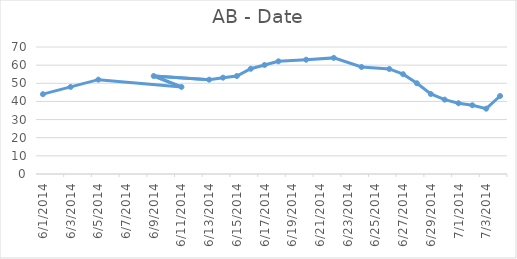
| Category | AB |
|---|---|
| 6/1/14 | 44 |
| 6/3/14 | 48 |
| 6/5/14 | 52 |
| 6/11/14 | 48 |
| 6/9/14 | 54 |
| 6/13/14 | 52 |
| 6/14/14 | 53.1 |
| 6/15/14 | 54 |
| 6/16/14 | 58 |
| 6/17/14 | 60.1 |
| 6/18/14 | 62.1 |
| 6/20/14 | 63 |
| 6/22/14 | 64 |
| 6/24/14 | 59 |
| 6/26/14 | 57.9 |
| 6/27/14 | 55 |
| 6/28/14 | 50 |
| 6/29/14 | 44.1 |
| 6/30/14 | 41 |
| 7/1/14 | 39 |
| 7/2/14 | 37.9 |
| 7/3/14 | 36 |
| 7/4/14 | 43 |